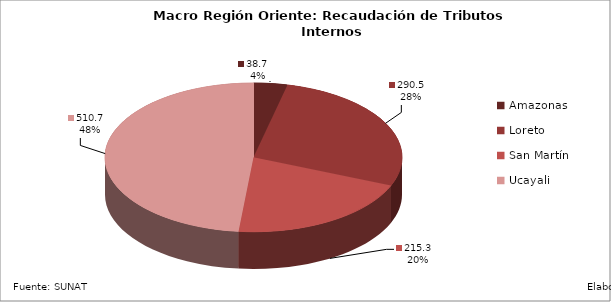
| Category | Series 0 |
|---|---|
| Amazonas | 38.74 |
| Loreto | 290.526 |
| San Martín | 215.321 |
| Ucayali | 510.748 |